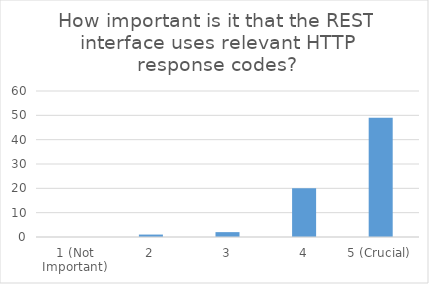
| Category | How important is it that the REST interface uses relevant HTTP response codes? |
|---|---|
| 1 (Not Important) | 0 |
| 2 | 1 |
| 3 | 2 |
| 4 | 20 |
| 5 (Crucial) | 49 |